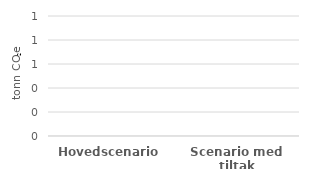
| Category | Transport |
|---|---|
| Hovedscenario | 0 |
| Scenario med tiltak | 0 |